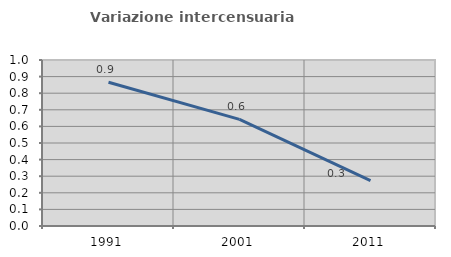
| Category | Variazione intercensuaria annua |
|---|---|
| 1991.0 | 0.866 |
| 2001.0 | 0.642 |
| 2011.0 | 0.273 |